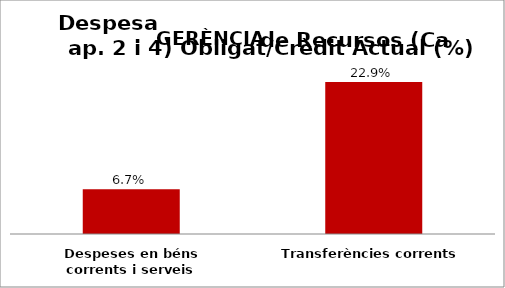
| Category | Series 0 |
|---|---|
| Despeses en béns corrents i serveis | 0.067 |
| Transferències corrents | 0.229 |